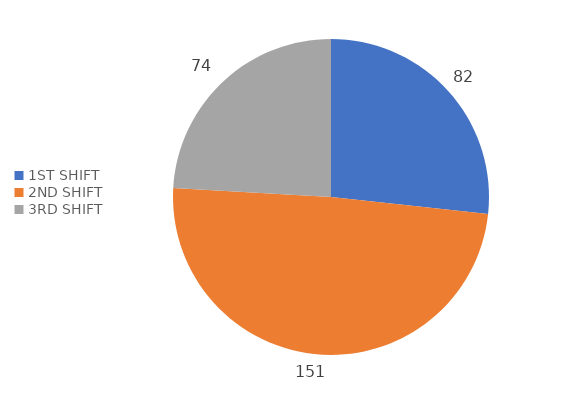
| Category | DOWNTIME |
|---|---|
| 1ST SHIFT | 82 |
| 2ND SHIFT | 151 |
| 3RD SHIFT | 74 |